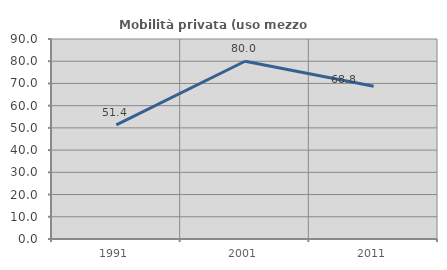
| Category | Mobilità privata (uso mezzo privato) |
|---|---|
| 1991.0 | 51.351 |
| 2001.0 | 80 |
| 2011.0 | 68.75 |